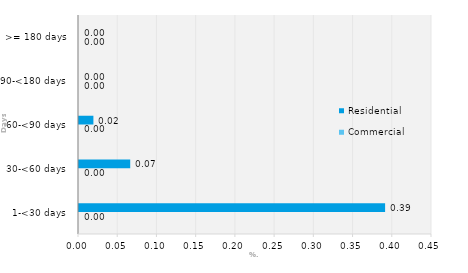
| Category | Commercial | Residential |
|---|---|---|
| 1-<30 days | 0 | 0.39 |
| 30-<60 days | 0 | 0.065 |
| 60-<90 days | 0 | 0.018 |
| 90-<180 days | 0 | 0 |
| >= 180 days | 0 | 0 |